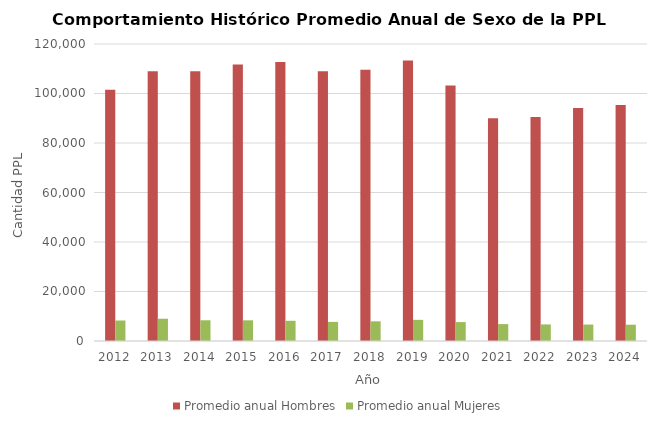
| Category | Promedio anual Hombres | Promedio anual Mujeres |
|---|---|---|
| 2012.0 | 101548.333 | 8273.75 |
| 2013.0 | 108988.333 | 8997.917 |
| 2014.0 | 109009.667 | 8379.417 |
| 2015.0 | 111689.083 | 8351 |
| 2016.0 | 112747 | 8167 |
| 2017.0 | 108939.917 | 7717.75 |
| 2018.0 | 109615.417 | 7954.167 |
| 2019.0 | 113308.833 | 8538.5 |
| 2020.0 | 103182.75 | 7647.583 |
| 2021.0 | 90002.917 | 6834.583 |
| 2022.0 | 90472.5 | 6703.417 |
| 2023.0 | 94091.083 | 6646.667 |
| 2024.0 | 95325.667 | 6583 |